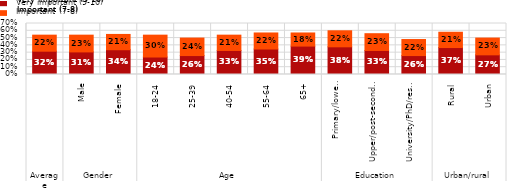
| Category | Very important (9-10) | Important (7-8) |
|---|---|---|
| 0 | 0.32 | 0.22 |
| 1 | 0.31 | 0.23 |
| 2 | 0.34 | 0.21 |
| 3 | 0.24 | 0.3 |
| 4 | 0.26 | 0.24 |
| 5 | 0.33 | 0.21 |
| 6 | 0.35 | 0.22 |
| 7 | 0.39 | 0.18 |
| 8 | 0.38 | 0.22 |
| 9 | 0.33 | 0.23 |
| 10 | 0.26 | 0.22 |
| 11 | 0.37 | 0.21 |
| 12 | 0.27 | 0.23 |